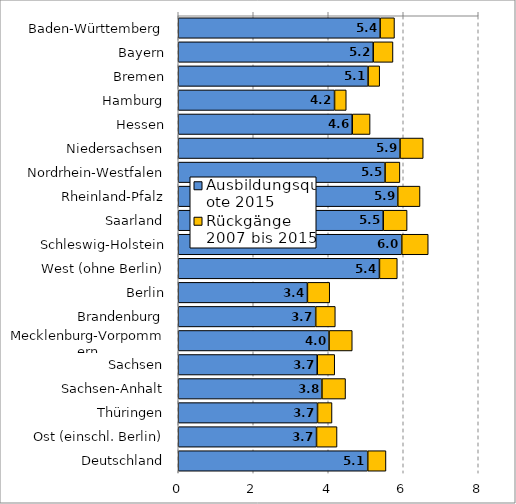
| Category | Ausbildungsquote 2015 | Rückgänge 2007 bis 2015 |
|---|---|---|
| Baden-Württemberg | 5.384 | 0.383 |
| Bayern | 5.199 | 0.527 |
| Bremen | 5.062 | 0.31 |
| Hamburg | 4.168 | 0.313 |
| Hessen | 4.639 | 0.476 |
| Niedersachsen | 5.914 | 0.619 |
| Nordrhein-Westfalen | 5.515 | 0.396 |
| Rheinland-Pfalz | 5.854 | 0.593 |
| Saarland | 5.466 | 0.637 |
| Schleswig-Holstein | 5.96 | 0.706 |
| West (ohne Berlin) | 5.365 | 0.476 |
| Berlin | 3.444 | 0.595 |
| Brandenburg | 3.665 | 0.523 |
| Mecklenburg-Vorpommern | 4.022 | 0.619 |
| Sachsen | 3.706 | 0.467 |
| Sachsen-Anhalt | 3.831 | 0.63 |
| Thüringen | 3.714 | 0.386 |
| Ost (einschl. Berlin) | 3.687 | 0.546 |
| Deutschland | 5.053 | 0.486 |